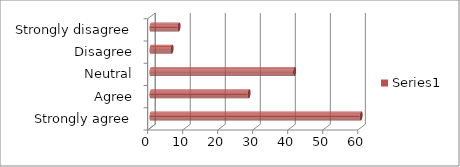
| Category | Series 0 |
|---|---|
| Strongly agree | 60 |
| Agree | 28 |
| Neutral | 41 |
| Disagree | 6 |
| Strongly disagree | 8 |